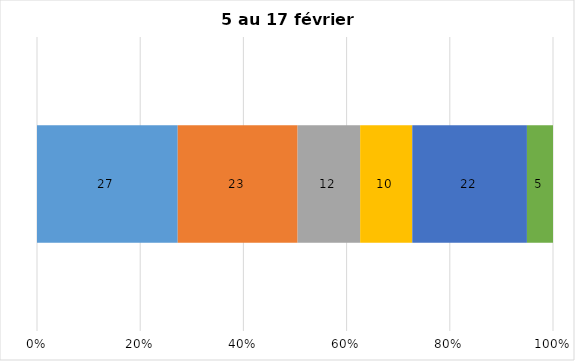
| Category | Plusieurs fois par jour | Une fois par jour | Quelques fois par semaine   | Une fois par semaine ou moins   |  Jamais   |  Je n’utilise pas les médias sociaux |
|---|---|---|---|---|---|---|
| 0 | 27 | 23 | 12 | 10 | 22 | 5 |